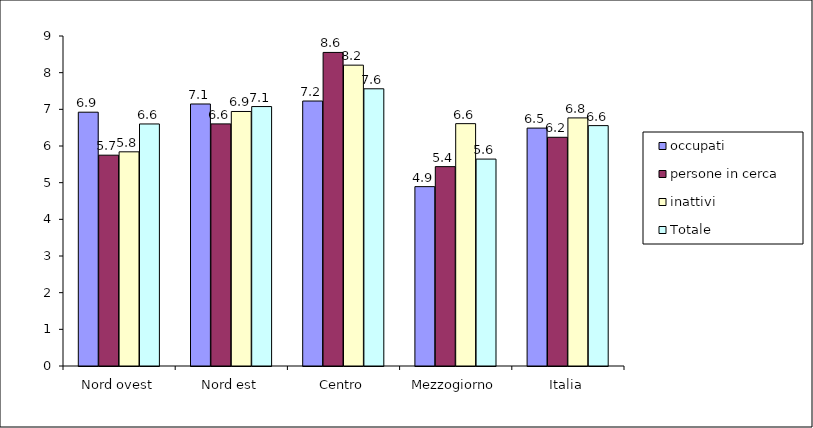
| Category | occupati | persone in cerca | inattivi | Totale |
|---|---|---|---|---|
| Nord ovest | 6.922 | 5.75 | 5.841 | 6.601 |
| Nord est | 7.146 | 6.603 | 6.941 | 7.076 |
| Centro | 7.227 | 8.552 | 8.205 | 7.56 |
| Mezzogiorno | 4.892 | 5.437 | 6.61 | 5.643 |
| Italia | 6.488 | 6.238 | 6.766 | 6.556 |